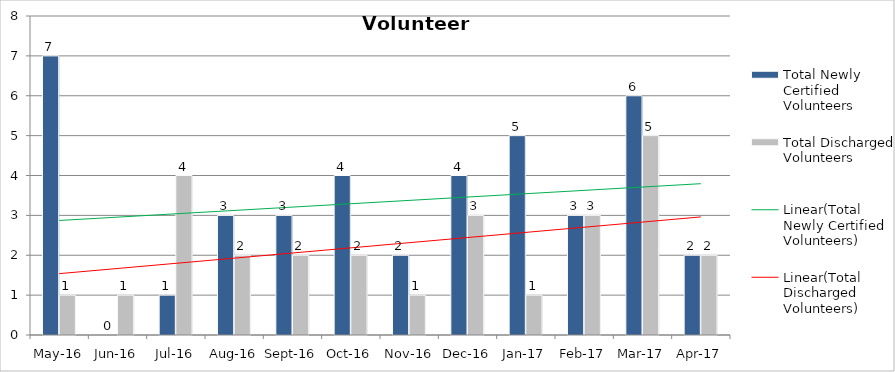
| Category | Total Newly Certified Volunteers | Total Discharged Volunteers |
|---|---|---|
| May-16 | 7 | 1 |
| Jun-16 | 0 | 1 |
| Jul-16 | 1 | 4 |
| Aug-16 | 3 | 2 |
| Sep-16 | 3 | 2 |
| Oct-16 | 4 | 2 |
| Nov-16 | 2 | 1 |
| Dec-16 | 4 | 3 |
| Jan-17 | 5 | 1 |
| Feb-17 | 3 | 3 |
| Mar-17 | 6 | 5 |
| Apr-17 | 2 | 2 |